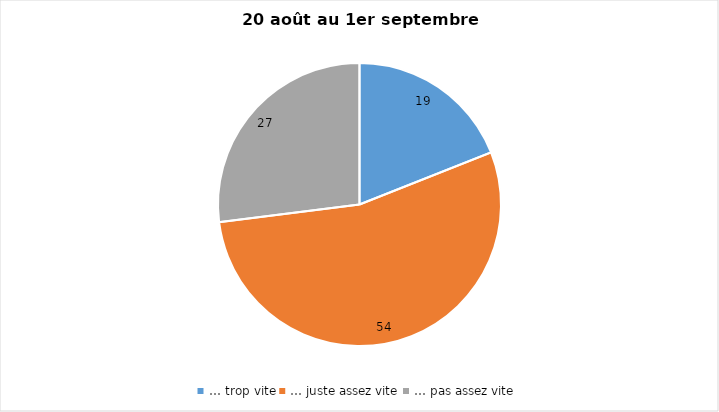
| Category | Series 0 |
|---|---|
| … trop vite | 19 |
| … juste assez vite | 54 |
| … pas assez vite | 27 |